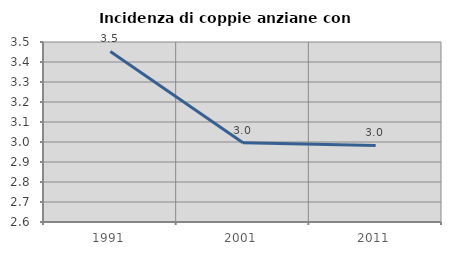
| Category | Incidenza di coppie anziane con figli |
|---|---|
| 1991.0 | 3.453 |
| 2001.0 | 2.996 |
| 2011.0 | 2.983 |